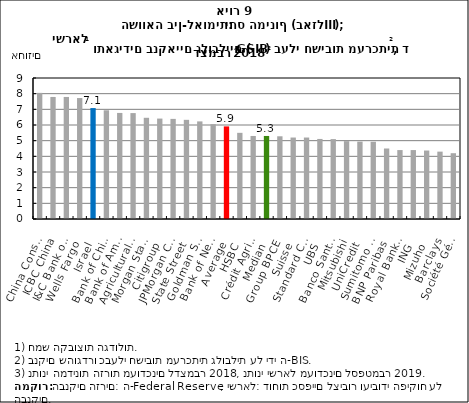
| Category | Series 2 |
|---|---|
| China Construction | 8.05 |
| ICBC China | 7.79 |
| I&C Bank of China | 7.79 |
| Wells Fargo | 7.72 |
| Israel | 7.08 |
| Bank of China Limited | 6.94 |
| Bank of America | 6.77 |
| Agricultural Bank of China | 6.76 |
| Morgan Stanley | 6.46 |
| Citigroup | 6.41 |
| JPMorgan Chase & Co | 6.39 |
| State Street | 6.33 |
| Goldman Sachs | 6.23 |
| Bank of New York Mellon | 6.05 |
| Average | 5.91 |
| HSBC | 5.5 |
| Crédit Agricole | 5.3 |
| Median | 5.3 |
| Group BPCE | 5.28 |
| Suisse | 5.2 |
| Standard Chartered | 5.2 |
| UBS | 5.11 |
| Banco Santander | 5.1 |
| Mitsubishi | 4.97 |
| UniCredit | 4.94 |
| Sumitomo Mitsui | 4.93 |
| BNP Paribas | 4.5 |
| Royal Bank of Canada | 4.4 |
| ING | 4.4 |
| Mizuho | 4.37 |
| Barclays | 4.3 |
| Société Générale | 4.2 |